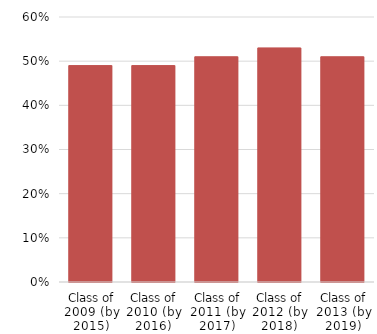
| Category | Series 0 |
|---|---|
| Class of 2009 (by 2015) | 0.49 |
| Class of 2010 (by 2016) | 0.49 |
| Class of 2011 (by 2017) | 0.51 |
| Class of 2012 (by 2018) | 0.53 |
| Class of 2013 (by 2019) | 0.51 |